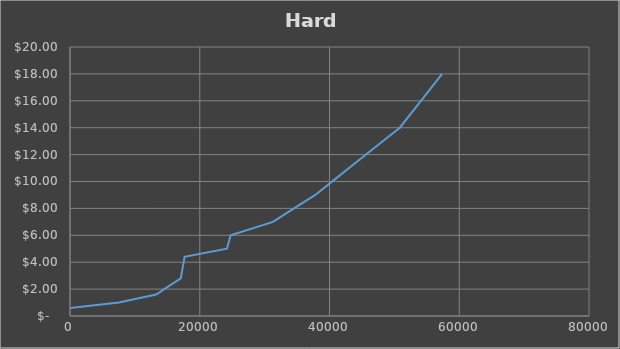
| Category | Series 0 |
|---|---|
| 0.0 | 0.6 |
| 3775.0 | 0.8 |
| 7550.0 | 1 |
| 10415.5 | 1.3 |
| 13281.0 | 1.6 |
| 15179.0 | 2.2 |
| 17077.0 | 2.8 |
| 17662.0 | 4.4 |
| 24179.55 | 5 |
| 24764.55 | 6 |
| 31282.1 | 7 |
| 37799.65 | 9 |
| 41058.425 | 10.25 |
| 44317.200000000004 | 11.5 |
| 47575.975000000006 | 12.75 |
| 50834.75000000001 | 14 |
| 54093.52500000001 | 16 |
| 57352.30000000001 | 18 |